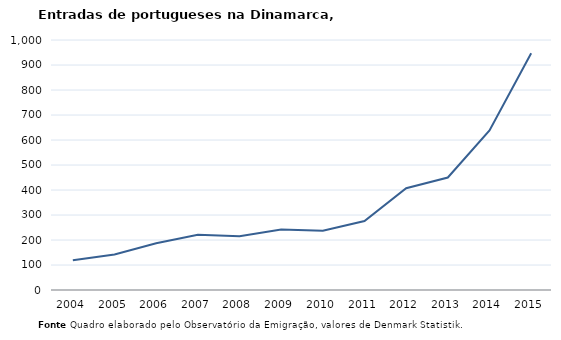
| Category | Entradas |
|---|---|
| 2004.0 | 119 |
| 2005.0 | 142 |
| 2006.0 | 187 |
| 2007.0 | 221 |
| 2008.0 | 215 |
| 2009.0 | 242 |
| 2010.0 | 237 |
| 2011.0 | 276 |
| 2012.0 | 407 |
| 2013.0 | 450 |
| 2014.0 | 638 |
| 2015.0 | 947 |